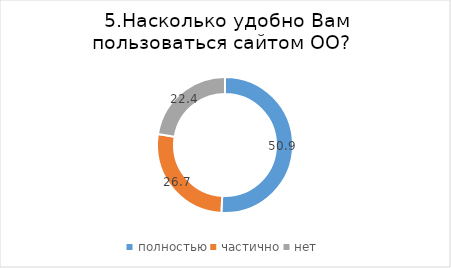
| Category | Series 0 |
|---|---|
| полностью | 50.862 |
| частично | 26.724 |
| нет | 22.414 |